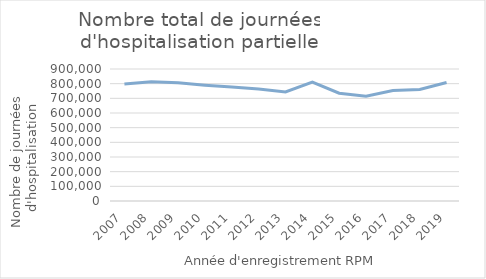
| Category | Nombre total de journées d'hospitalisation |
|---|---|
| 2007.0 | 797892 |
| 2008.0 | 812880 |
| 2009.0 | 806062 |
| 2010.0 | 789713 |
| 2011.0 | 776572 |
| 2012.0 | 763418 |
| 2013.0 | 743923 |
| 2014.0 | 810833 |
| 2015.0 | 735183 |
| 2016.0 | 714619 |
| 2017.0 | 753509 |
| 2018.0 | 759882 |
| 2019.0 | 808042 |